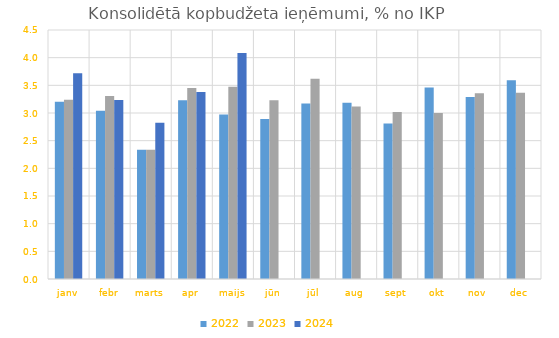
| Category | 2022 | 2023 | 2024 |
|---|---|---|---|
| janv | 3.205 | 3.241 | 3.717 |
| febr | 3.039 | 3.309 | 3.234 |
| marts | 2.335 | 2.335 | 2.825 |
| apr | 3.232 | 3.452 | 3.379 |
| maijs | 2.974 | 3.476 | 4.086 |
| jūn | 2.892 | 3.232 | 0 |
| jūl | 3.172 | 3.618 | 0 |
| aug | 3.184 | 3.118 | 0 |
| sept | 2.811 | 3.018 | 0 |
| okt | 3.461 | 2.998 | 0 |
| nov | 3.287 | 3.356 | 0 |
| dec | 3.594 | 3.367 | 0 |